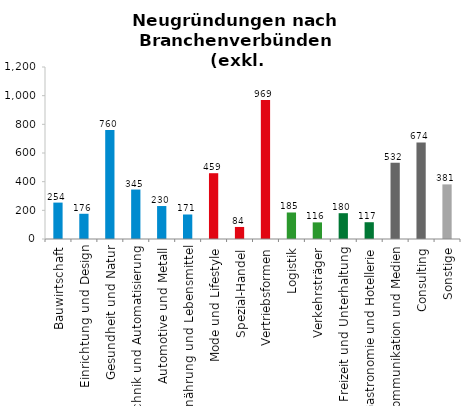
| Category | Series 1 |
|---|---|
| Bauwirtschaft | 254 |
| Einrichtung und Design | 176 |
| Gesundheit und Natur | 760 |
| Technik und Automatisierung | 345 |
| Automotive und Metall | 230 |
| Ernährung und Lebensmittel | 171 |
| Mode und Lifestyle | 459 |
| Spezial-Handel | 84 |
| Vertriebsformen | 969 |
| Logistik | 185 |
| Verkehrsträger | 116 |
| Freizeit und Unterhaltung | 180 |
| Gastronomie und Hotellerie | 117 |
| Kommunikation und Medien | 532 |
| Consulting | 674 |
| Sonstige | 381 |